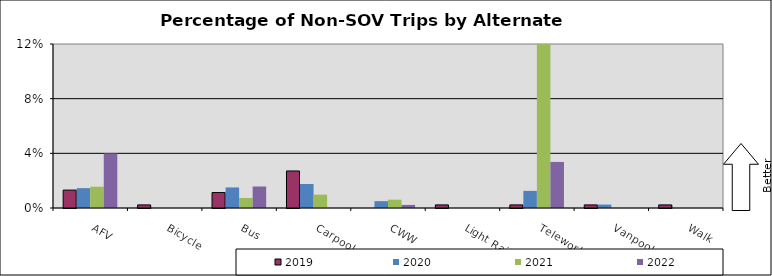
| Category | 2019 | 2020 | 2021 | 2022 |
|---|---|---|---|---|
| AFV | 0.013 | 0.015 | 0.016 | 0.04 |
| Bicycle | 0.002 | 0 | 0 | 0 |
| Bus | 0.011 | 0.015 | 0.007 | 0.016 |
| Carpool | 0.027 | 0.018 | 0.01 | 0 |
| CWW | 0 | 0.005 | 0.006 | 0.002 |
| Light Rail | 0.002 | 0 | 0 | 0 |
| Telework | 0.002 | 0.013 | 0.132 | 0.034 |
| Vanpool | 0.002 | 0.003 | 0 | 0 |
| Walk | 0.002 | 0 | 0 | 0 |